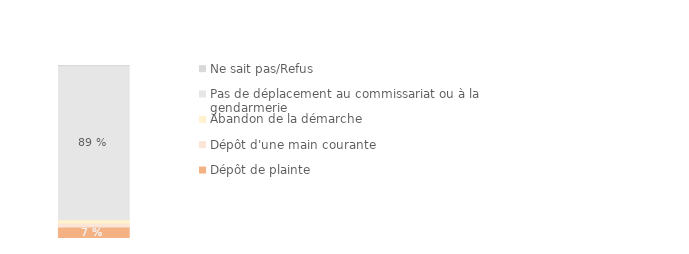
| Category | Dépôt de plainte | Dépôt d'une main courante | Abandon de la démarche | Pas de déplacement au commissariat ou à la gendarmerie | Ne sait pas/Refus |
|---|---|---|---|---|---|
| Victimes de menaces par personne connue | 0.066 | 0.022 | 0.02 | 0.89 | 0.002 |